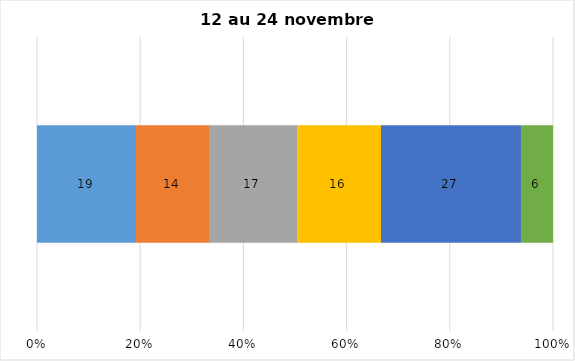
| Category | Plusieurs fois par jour | Une fois par jour | Quelques fois par semaine   | Une fois par semaine ou moins   |  Jamais   |  Je n’utilise pas les médias sociaux |
|---|---|---|---|---|---|---|
| 0 | 19 | 14 | 17 | 16 | 27 | 6 |